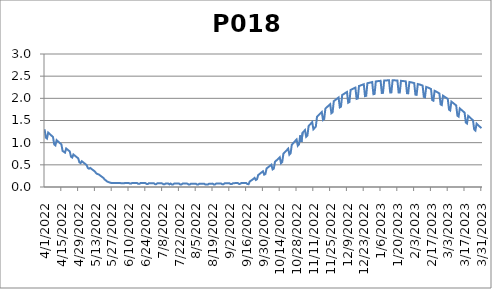
| Category | P018 |
|---|---|
| 4/1/22 | 1.303 |
| 4/2/22 | 1.114 |
| 4/3/22 | 1.093 |
| 4/4/22 | 1.227 |
| 4/5/22 | 1.203 |
| 4/6/22 | 1.177 |
| 4/7/22 | 1.153 |
| 4/8/22 | 1.129 |
| 4/9/22 | 0.96 |
| 4/10/22 | 0.939 |
| 4/11/22 | 1.057 |
| 4/12/22 | 1.033 |
| 4/13/22 | 1.008 |
| 4/14/22 | 0.985 |
| 4/15/22 | 0.962 |
| 4/16/22 | 0.813 |
| 4/17/22 | 0.795 |
| 4/18/22 | 0.776 |
| 4/19/22 | 0.868 |
| 4/20/22 | 0.845 |
| 4/21/22 | 0.823 |
| 4/22/22 | 0.802 |
| 4/23/22 | 0.683 |
| 4/24/22 | 0.664 |
| 4/25/22 | 0.734 |
| 4/26/22 | 0.712 |
| 4/27/22 | 0.69 |
| 4/28/22 | 0.669 |
| 4/29/22 | 0.647 |
| 4/30/22 | 0.557 |
| 5/1/22 | 0.538 |
| 5/2/22 | 0.581 |
| 5/3/22 | 0.56 |
| 5/4/22 | 0.539 |
| 5/5/22 | 0.517 |
| 5/6/22 | 0.495 |
| 5/7/22 | 0.431 |
| 5/8/22 | 0.413 |
| 5/9/22 | 0.431 |
| 5/10/22 | 0.409 |
| 5/11/22 | 0.389 |
| 5/12/22 | 0.368 |
| 5/13/22 | 0.347 |
| 5/14/22 | 0.31 |
| 5/15/22 | 0.293 |
| 5/16/22 | 0.285 |
| 5/17/22 | 0.265 |
| 5/18/22 | 0.245 |
| 5/19/22 | 0.226 |
| 5/20/22 | 0.205 |
| 5/21/22 | 0.17 |
| 5/22/22 | 0.149 |
| 5/23/22 | 0.126 |
| 5/24/22 | 0.114 |
| 5/25/22 | 0.102 |
| 5/26/22 | 0.096 |
| 5/27/22 | 0.088 |
| 5/28/22 | 0.09 |
| 5/29/22 | 0.089 |
| 5/30/22 | 0.089 |
| 5/31/22 | 0.089 |
| 6/1/22 | 0.089 |
| 6/2/22 | 0.089 |
| 6/3/22 | 0.09 |
| 6/4/22 | 0.084 |
| 6/5/22 | 0.083 |
| 6/6/22 | 0.082 |
| 6/7/22 | 0.091 |
| 6/8/22 | 0.091 |
| 6/9/22 | 0.091 |
| 6/10/22 | 0.092 |
| 6/11/22 | 0.077 |
| 6/12/22 | 0.076 |
| 6/13/22 | 0.092 |
| 6/14/22 | 0.093 |
| 6/15/22 | 0.093 |
| 6/16/22 | 0.092 |
| 6/17/22 | 0.092 |
| 6/18/22 | 0.072 |
| 6/19/22 | 0.071 |
| 6/20/22 | 0.09 |
| 6/21/22 | 0.09 |
| 6/22/22 | 0.089 |
| 6/23/22 | 0.089 |
| 6/24/22 | 0.088 |
| 6/25/22 | 0.068 |
| 6/26/22 | 0.068 |
| 6/27/22 | 0.087 |
| 6/28/22 | 0.087 |
| 6/29/22 | 0.086 |
| 6/30/22 | 0.086 |
| 7/1/22 | 0.085 |
| 7/2/22 | 0.065 |
| 7/3/22 | 0.064 |
| 7/4/22 | 0.084 |
| 7/5/22 | 0.083 |
| 7/6/22 | 0.083 |
| 7/7/22 | 0.082 |
| 7/8/22 | 0.082 |
| 7/9/22 | 0.061 |
| 7/10/22 | 0.061 |
| 7/11/22 | 0.08 |
| 7/12/22 | 0.08 |
| 7/13/22 | 0.079 |
| 7/14/22 | 0.059 |
| 7/15/22 | 0.078 |
| 7/16/22 | 0.058 |
| 7/17/22 | 0.058 |
| 7/18/22 | 0.078 |
| 7/19/22 | 0.078 |
| 7/20/22 | 0.077 |
| 7/21/22 | 0.077 |
| 7/22/22 | 0.077 |
| 7/23/22 | 0.057 |
| 7/24/22 | 0.057 |
| 7/25/22 | 0.077 |
| 7/26/22 | 0.077 |
| 7/27/22 | 0.076 |
| 7/28/22 | 0.076 |
| 7/29/22 | 0.076 |
| 7/30/22 | 0.056 |
| 7/31/22 | 0.056 |
| 8/1/22 | 0.076 |
| 8/2/22 | 0.076 |
| 8/3/22 | 0.075 |
| 8/4/22 | 0.075 |
| 8/5/22 | 0.075 |
| 8/6/22 | 0.055 |
| 8/7/22 | 0.055 |
| 8/8/22 | 0.075 |
| 8/9/22 | 0.075 |
| 8/10/22 | 0.074 |
| 8/11/22 | 0.074 |
| 8/12/22 | 0.074 |
| 8/13/22 | 0.054 |
| 8/14/22 | 0.054 |
| 8/15/22 | 0.054 |
| 8/16/22 | 0.074 |
| 8/17/22 | 0.075 |
| 8/18/22 | 0.076 |
| 8/19/22 | 0.076 |
| 8/20/22 | 0.057 |
| 8/21/22 | 0.058 |
| 8/22/22 | 0.078 |
| 8/23/22 | 0.079 |
| 8/24/22 | 0.079 |
| 8/25/22 | 0.08 |
| 8/26/22 | 0.081 |
| 8/27/22 | 0.062 |
| 8/28/22 | 0.062 |
| 8/29/22 | 0.083 |
| 8/30/22 | 0.083 |
| 8/31/22 | 0.084 |
| 9/1/22 | 0.084 |
| 9/2/22 | 0.085 |
| 9/3/22 | 0.065 |
| 9/4/22 | 0.066 |
| 9/5/22 | 0.086 |
| 9/6/22 | 0.087 |
| 9/7/22 | 0.088 |
| 9/8/22 | 0.088 |
| 9/9/22 | 0.089 |
| 9/10/22 | 0.07 |
| 9/11/22 | 0.071 |
| 9/12/22 | 0.091 |
| 9/13/22 | 0.092 |
| 9/14/22 | 0.092 |
| 9/15/22 | 0.093 |
| 9/16/22 | 0.091 |
| 9/17/22 | 0.067 |
| 9/18/22 | 0.064 |
| 9/19/22 | 0.126 |
| 9/20/22 | 0.144 |
| 9/21/22 | 0.163 |
| 9/22/22 | 0.183 |
| 9/23/22 | 0.205 |
| 9/24/22 | 0.159 |
| 9/25/22 | 0.175 |
| 9/26/22 | 0.271 |
| 9/27/22 | 0.29 |
| 9/28/22 | 0.312 |
| 9/29/22 | 0.333 |
| 9/30/22 | 0.354 |
| 10/1/22 | 0.278 |
| 10/2/22 | 0.294 |
| 10/3/22 | 0.419 |
| 10/4/22 | 0.44 |
| 10/5/22 | 0.46 |
| 10/6/22 | 0.482 |
| 10/7/22 | 0.504 |
| 10/8/22 | 0.397 |
| 10/9/22 | 0.415 |
| 10/10/22 | 0.57 |
| 10/11/22 | 0.594 |
| 10/12/22 | 0.617 |
| 10/13/22 | 0.643 |
| 10/14/22 | 0.669 |
| 10/15/22 | 0.536 |
| 10/16/22 | 0.563 |
| 10/17/22 | 0.75 |
| 10/18/22 | 0.779 |
| 10/19/22 | 0.808 |
| 10/20/22 | 0.836 |
| 10/21/22 | 0.866 |
| 10/22/22 | 0.73 |
| 10/23/22 | 0.758 |
| 10/24/22 | 0.954 |
| 10/25/22 | 0.984 |
| 10/26/22 | 1.012 |
| 10/27/22 | 1.043 |
| 10/28/22 | 1.073 |
| 10/29/22 | 0.93 |
| 10/30/22 | 0.959 |
| 10/31/22 | 1.164 |
| 11/1/22 | 1.014 |
| 11/2/22 | 1.222 |
| 11/3/22 | 1.254 |
| 11/4/22 | 1.283 |
| 11/5/22 | 1.131 |
| 11/6/22 | 1.159 |
| 11/7/22 | 1.374 |
| 11/8/22 | 1.405 |
| 11/9/22 | 1.434 |
| 11/10/22 | 1.464 |
| 11/11/22 | 1.302 |
| 11/12/22 | 1.331 |
| 11/13/22 | 1.359 |
| 11/14/22 | 1.582 |
| 11/15/22 | 1.612 |
| 11/16/22 | 1.638 |
| 11/17/22 | 1.665 |
| 11/18/22 | 1.693 |
| 11/19/22 | 1.512 |
| 11/20/22 | 1.535 |
| 11/21/22 | 1.77 |
| 11/22/22 | 1.795 |
| 11/23/22 | 1.819 |
| 11/24/22 | 1.844 |
| 11/25/22 | 1.868 |
| 11/26/22 | 1.664 |
| 11/27/22 | 1.684 |
| 11/28/22 | 1.936 |
| 11/29/22 | 1.957 |
| 11/30/22 | 1.977 |
| 12/1/22 | 1.998 |
| 12/2/22 | 2.019 |
| 12/3/22 | 1.796 |
| 12/4/22 | 1.812 |
| 12/5/22 | 2.077 |
| 12/6/22 | 2.092 |
| 12/7/22 | 2.11 |
| 12/8/22 | 2.127 |
| 12/9/22 | 2.144 |
| 12/10/22 | 1.901 |
| 12/11/22 | 1.915 |
| 12/12/22 | 2.19 |
| 12/13/22 | 2.203 |
| 12/14/22 | 2.216 |
| 12/15/22 | 2.231 |
| 12/16/22 | 2.242 |
| 12/17/22 | 1.988 |
| 12/18/22 | 1.997 |
| 12/19/22 | 2.279 |
| 12/20/22 | 2.287 |
| 12/21/22 | 2.298 |
| 12/22/22 | 2.307 |
| 12/23/22 | 2.318 |
| 12/24/22 | 2.051 |
| 12/25/22 | 2.057 |
| 12/26/22 | 2.341 |
| 12/27/22 | 2.348 |
| 12/28/22 | 2.353 |
| 12/29/22 | 2.36 |
| 12/30/22 | 2.367 |
| 12/31/22 | 2.093 |
| 1/1/23 | 2.099 |
| 1/2/23 | 2.38 |
| 1/3/23 | 2.386 |
| 1/4/23 | 2.389 |
| 1/5/23 | 2.392 |
| 1/6/23 | 2.396 |
| 1/7/23 | 2.122 |
| 1/8/23 | 2.124 |
| 1/9/23 | 2.402 |
| 1/10/23 | 2.404 |
| 1/11/23 | 2.404 |
| 1/12/23 | 2.406 |
| 1/13/23 | 2.407 |
| 1/14/23 | 2.134 |
| 1/15/23 | 2.134 |
| 1/16/23 | 2.407 |
| 1/17/23 | 2.406 |
| 1/18/23 | 2.405 |
| 1/19/23 | 2.403 |
| 1/20/23 | 2.402 |
| 1/21/23 | 2.132 |
| 1/22/23 | 2.131 |
| 1/23/23 | 2.395 |
| 1/24/23 | 2.392 |
| 1/25/23 | 2.389 |
| 1/26/23 | 2.386 |
| 1/27/23 | 2.382 |
| 1/28/23 | 2.116 |
| 1/29/23 | 2.113 |
| 1/30/23 | 2.368 |
| 1/31/23 | 2.364 |
| 2/1/23 | 2.358 |
| 2/2/23 | 2.351 |
| 2/3/23 | 2.344 |
| 2/4/23 | 2.084 |
| 2/5/23 | 2.078 |
| 2/6/23 | 2.323 |
| 2/7/23 | 2.316 |
| 2/8/23 | 2.308 |
| 2/9/23 | 2.298 |
| 2/10/23 | 2.289 |
| 2/11/23 | 2.033 |
| 2/12/23 | 2.024 |
| 2/13/23 | 2.257 |
| 2/14/23 | 2.247 |
| 2/15/23 | 2.237 |
| 2/16/23 | 2.224 |
| 2/17/23 | 2.211 |
| 2/18/23 | 1.96 |
| 2/19/23 | 1.947 |
| 2/20/23 | 2.17 |
| 2/21/23 | 2.156 |
| 2/22/23 | 2.142 |
| 2/23/23 | 2.126 |
| 2/24/23 | 2.109 |
| 2/25/23 | 1.864 |
| 2/26/23 | 1.849 |
| 2/27/23 | 2.06 |
| 2/28/23 | 2.042 |
| 3/1/23 | 2.024 |
| 3/2/23 | 2.006 |
| 3/3/23 | 1.985 |
| 3/4/23 | 1.746 |
| 3/5/23 | 1.726 |
| 3/6/23 | 1.926 |
| 3/7/23 | 1.904 |
| 3/8/23 | 1.883 |
| 3/9/23 | 1.861 |
| 3/10/23 | 1.839 |
| 3/11/23 | 1.608 |
| 3/12/23 | 1.589 |
| 3/13/23 | 1.772 |
| 3/14/23 | 1.749 |
| 3/15/23 | 1.725 |
| 3/16/23 | 1.701 |
| 3/17/23 | 1.677 |
| 3/18/23 | 1.455 |
| 3/19/23 | 1.433 |
| 3/20/23 | 1.605 |
| 3/21/23 | 1.579 |
| 3/22/23 | 1.554 |
| 3/23/23 | 1.529 |
| 3/24/23 | 1.502 |
| 3/25/23 | 1.297 |
| 3/26/23 | 1.273 |
| 3/27/23 | 1.428 |
| 3/28/23 | 1.403 |
| 3/29/23 | 1.376 |
| 3/30/23 | 1.353 |
| 3/31/23 | 1.327 |